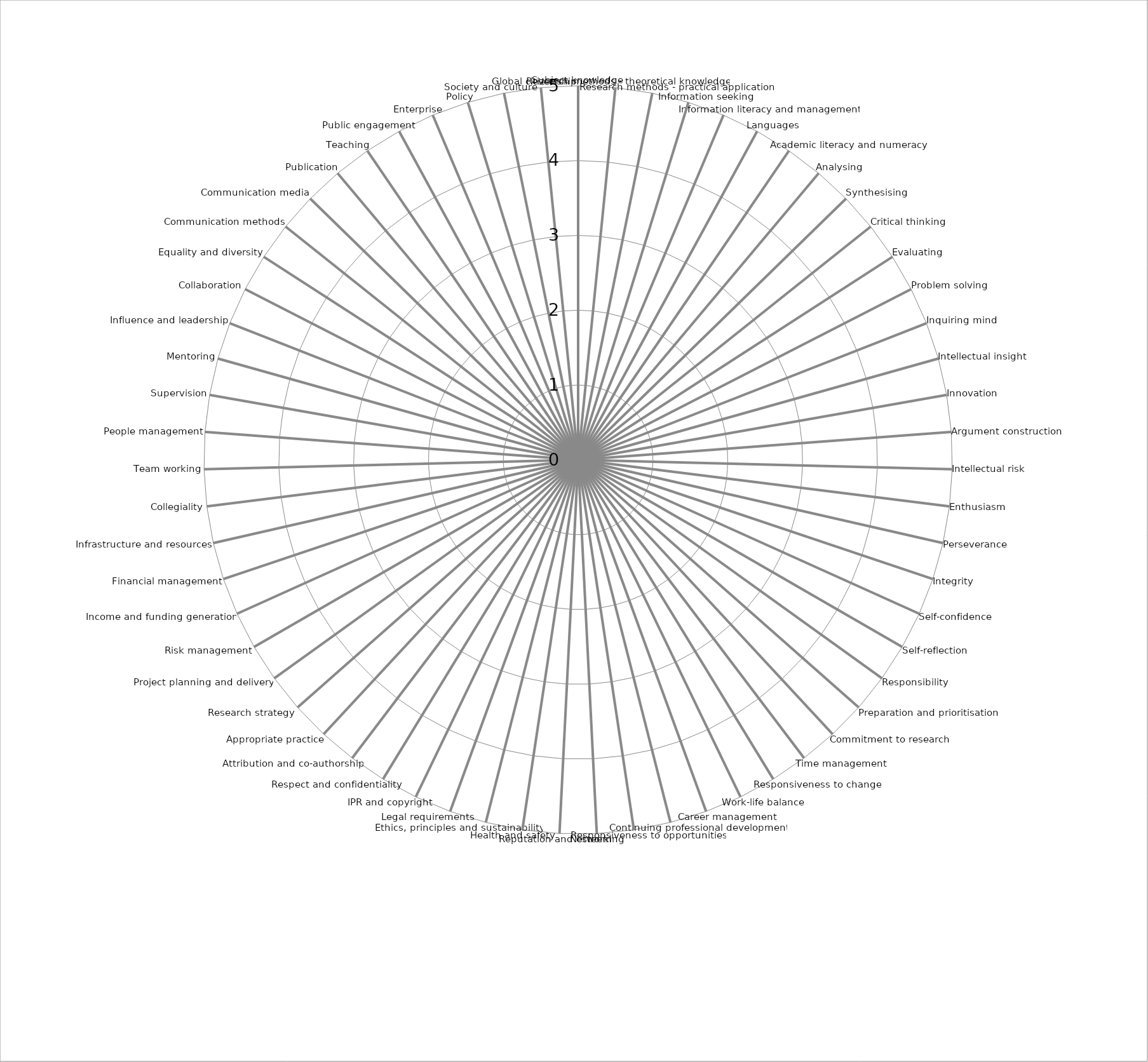
| Category | Series 0 | Series 1 | Series 2 | Series 3 | Series 4 |
|---|---|---|---|---|---|
| Subject knowledge | 0 | 0 | 0 | 0 | 0 |
| Research methods - theoretical knowledge | 0 | 0 | 0 | 0 | 0 |
| Research methods - practical application | 0 | 0 | 0 | 0 | 0 |
| Information seeking | 0 | 0 | 0 | 0 | 0 |
| Information literacy and management | 0 | 0 | 0 | 0 | 0 |
| Languages | 0 | 0 | 0 | 0 | 0 |
| Academic literacy and numeracy | 0 | 0 | 0 | 0 | 0 |
| Analysing | 0 | 0 | 0 | 0 | 0 |
| Synthesising | 0 | 0 | 0 | 0 | 0 |
| Critical thinking | 0 | 0 | 0 | 0 | 0 |
| Evaluating | 0 | 0 | 0 | 0 | 0 |
| Problem solving | 0 | 0 | 0 | 0 | 0 |
| Inquiring mind | 0 | 0 | 0 | 0 | 0 |
| Intellectual insight | 0 | 0 | 0 | 0 | 0 |
| Innovation | 0 | 0 | 0 | 0 | 0 |
| Argument construction | 0 | 0 | 0 | 0 | 0 |
| Intellectual risk | 0 | 0 | 0 | 0 | 0 |
| Enthusiasm | 0 | 0 | 0 | 0 | 0 |
| Perseverance | 0 | 0 | 0 | 0 | 0 |
| Integrity | 0 | 0 | 0 | 0 | 0 |
| Self-confidence | 0 | 0 | 0 | 0 | 0 |
| Self-reflection | 0 | 0 | 0 | 0 | 0 |
| Responsibility | 0 | 0 | 0 | 0 | 0 |
| Preparation and prioritisation | 0 | 0 | 0 | 0 | 0 |
| Commitment to research | 0 | 0 | 0 | 0 | 0 |
| Time management | 0 | 0 | 0 | 0 | 0 |
| Responsiveness to change | 0 | 0 | 0 | 0 | 0 |
| Work-life balance | 0 | 0 | 0 | 0 | 0 |
| Career management | 0 | 0 | 0 | 0 | 0 |
| Continuing professional development | 0 | 0 | 0 | 0 | 0 |
| Responsiveness to opportunities | 0 | 0 | 0 | 0 | 0 |
| Networking | 0 | 0 | 0 | 0 | 0 |
| Reputation and esteem | 0 | 0 | 0 | 0 | 0 |
| Health and safety | 0 | 0 | 0 | 0 | 0 |
| Ethics, principles and sustainability | 0 | 0 | 0 | 0 | 0 |
| Legal requirements | 0 | 0 | 0 | 0 | 0 |
| IPR and copyright | 0 | 0 | 0 | 0 | 0 |
| Respect and confidentiality | 0 | 0 | 0 | 0 | 0 |
| Attribution and co-authorship | 0 | 0 | 0 | 0 | 0 |
| Appropriate practice | 0 | 0 | 0 | 0 | 0 |
| Research strategy | 0 | 0 | 0 | 0 | 0 |
| Project planning and delivery | 0 | 0 | 0 | 0 | 0 |
| Risk management | 0 | 0 | 0 | 0 | 0 |
| Income and funding generation | 0 | 0 | 0 | 0 | 0 |
| Financial management | 0 | 0 | 0 | 0 | 0 |
| Infrastructure and resources | 0 | 0 | 0 | 0 | 0 |
| Collegiality | 0 | 0 | 0 | 0 | 0 |
| Team working | 0 | 0 | 0 | 0 | 0 |
| People management | 0 | 0 | 0 | 0 | 0 |
| Supervision | 0 | 0 | 0 | 0 | 0 |
| Mentoring | 0 | 0 | 0 | 0 | 0 |
| Influence and leadership | 0 | 0 | 0 | 0 | 0 |
| Collaboration | 0 | 0 | 0 | 0 | 0 |
| Equality and diversity | 0 | 0 | 0 | 0 | 0 |
| Communication methods | 0 | 0 | 0 | 0 | 0 |
| Communication media | 0 | 0 | 0 | 0 | 0 |
| Publication | 0 | 0 | 0 | 0 | 0 |
| Teaching | 0 | 0 | 0 | 0 | 0 |
| Public engagement | 0 | 0 | 0 | 0 | 0 |
| Enterprise | 0 | 0 | 0 | 0 | 0 |
| Policy | 0 | 0 | 0 | 0 | 0 |
| Society and culture | 0 | 0 | 0 | 0 | 0 |
| Global citizenship | 0 | 0 | 0 | 0 | 0 |